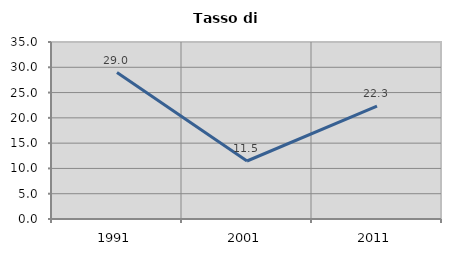
| Category | Tasso di disoccupazione   |
|---|---|
| 1991.0 | 28.96 |
| 2001.0 | 11.47 |
| 2011.0 | 22.308 |